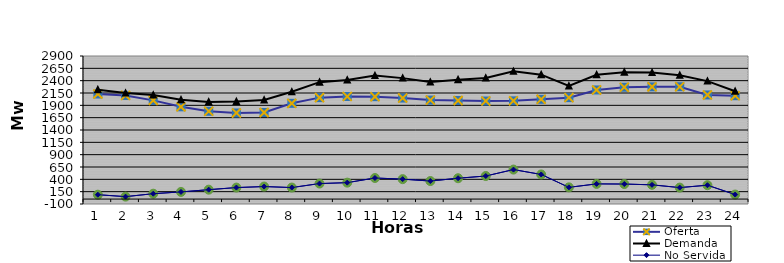
| Category | Oferta | No Servida | Demanda |
|---|---|---|---|
| 1.0 | 2129.57 | 88.214 | 2217.784 |
| 2.0 | 2100.46 | 49.358 | 2149.818 |
| 3.0 | 2000.21 | 108.686 | 2108.896 |
| 4.0 | 1869.66 | 145.018 | 2014.678 |
| 5.0 | 1779.68 | 190.333 | 1970.013 |
| 6.0 | 1745.23 | 233.042 | 1978.272 |
| 7.0 | 1754.51 | 253.514 | 2008.024 |
| 8.0 | 1940.79 | 233.381 | 2174.171 |
| 9.0 | 2056.15 | 313.974 | 2370.124 |
| 10.0 | 2079.46 | 332.717 | 2412.177 |
| 11.0 | 2075.24 | 427.067 | 2502.307 |
| 12.0 | 2047.69 | 403.837 | 2451.527 |
| 13.0 | 2006.29 | 365.267 | 2371.557 |
| 14.0 | 1997.49 | 422.324 | 2419.814 |
| 15.0 | 1987.54 | 467.5 | 2455.04 |
| 16.0 | 1991.21 | 597.75 | 2588.96 |
| 17.0 | 2022.53 | 498.747 | 2521.277 |
| 18.0 | 2055.81 | 237.312 | 2293.122 |
| 19.0 | 2211.57 | 307.561 | 2519.131 |
| 20.0 | 2266.91 | 304.713 | 2571.623 |
| 21.0 | 2274.51 | 288.528 | 2563.038 |
| 22.0 | 2277.04 | 232.86 | 2509.9 |
| 23.0 | 2110.1 | 280.803 | 2390.903 |
| 24.0 | 2095.2 | 91.25 | 2186.45 |